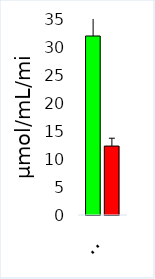
| Category | Control | ASD |
|---|---|---|
| GLTN | 31.967 | 12.308 |